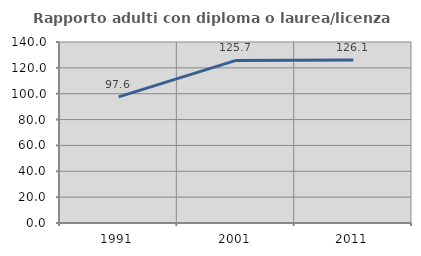
| Category | Rapporto adulti con diploma o laurea/licenza media  |
|---|---|
| 1991.0 | 97.561 |
| 2001.0 | 125.743 |
| 2011.0 | 126.05 |